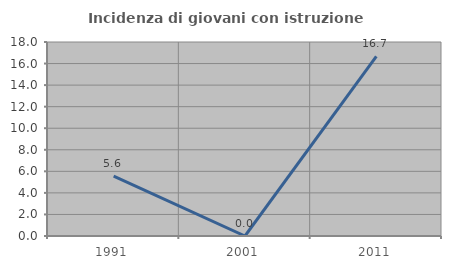
| Category | Incidenza di giovani con istruzione universitaria |
|---|---|
| 1991.0 | 5.556 |
| 2001.0 | 0 |
| 2011.0 | 16.667 |